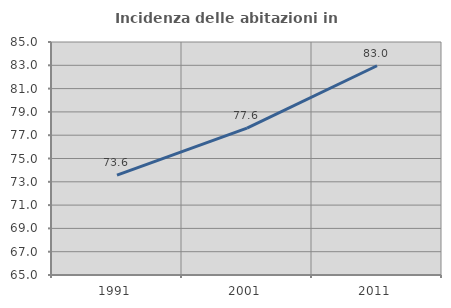
| Category | Incidenza delle abitazioni in proprietà  |
|---|---|
| 1991.0 | 73.568 |
| 2001.0 | 77.6 |
| 2011.0 | 82.963 |